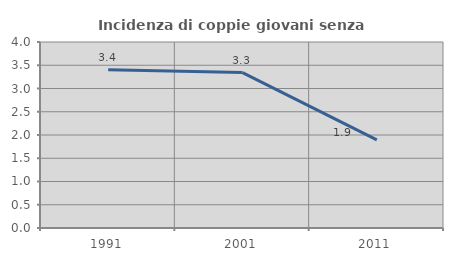
| Category | Incidenza di coppie giovani senza figli |
|---|---|
| 1991.0 | 3.402 |
| 2001.0 | 3.343 |
| 2011.0 | 1.894 |